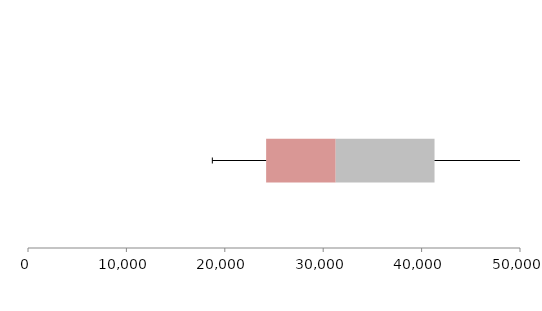
| Category | Series 1 | Series 2 | Series 3 |
|---|---|---|---|
| 0 | 24200.667 | 7070.346 | 10042.774 |